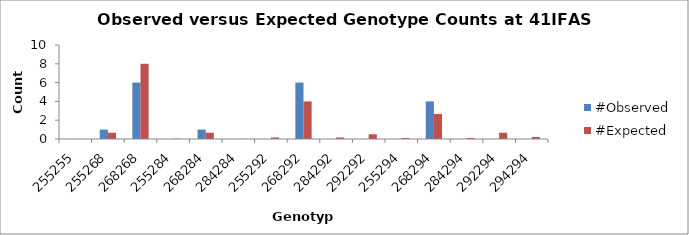
| Category | #Observed | #Expected |
|---|---|---|
| 255255.0 | 0 | 0.014 |
| 255268.0 | 1 | 0.667 |
| 268268.0 | 6 | 8 |
| 255284.0 | 0 | 0.028 |
| 268284.0 | 1 | 0.667 |
| 284284.0 | 0 | 0.014 |
| 255292.0 | 0 | 0.167 |
| 268292.0 | 6 | 4 |
| 284292.0 | 0 | 0.167 |
| 292292.0 | 0 | 0.5 |
| 255294.0 | 0 | 0.111 |
| 268294.0 | 4 | 2.667 |
| 284294.0 | 0 | 0.111 |
| 292294.0 | 0 | 0.667 |
| 294294.0 | 0 | 0.222 |